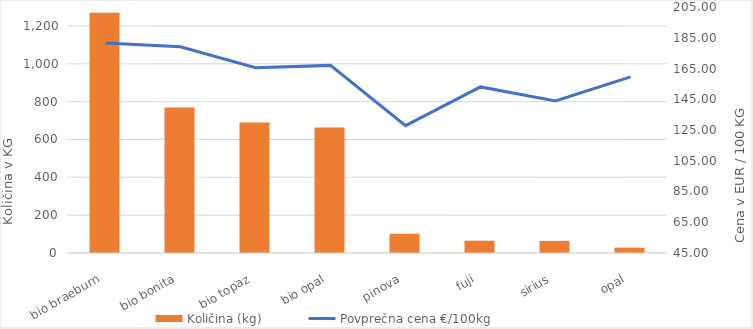
| Category | Količina (kg) |
|---|---|
| bio braeburn | 1270 |
| bio bonita | 769 |
| bio topaz | 690 |
| bio opal | 663 |
| pinova | 102 |
| fuji | 65 |
| sirius | 64 |
| opal | 28 |